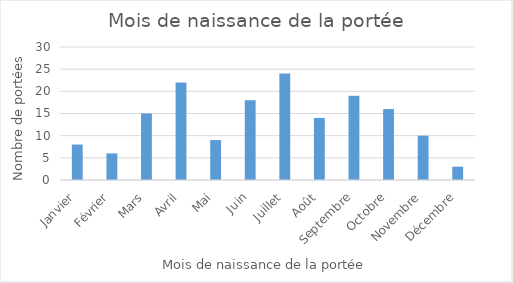
| Category | Series 0 |
|---|---|
| Janvier | 8 |
| Février | 6 |
| Mars | 15 |
| Avril | 22 |
| Mai | 9 |
| Juin | 18 |
| Juillet | 24 |
| Août | 14 |
| Septembre | 19 |
| Octobre | 16 |
| Novembre | 10 |
| Décembre | 3 |